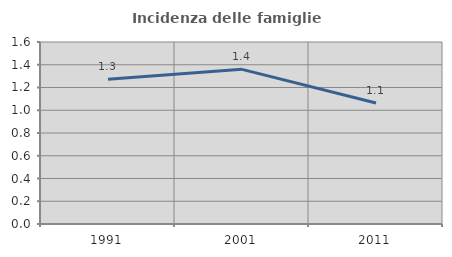
| Category | Incidenza delle famiglie numerose |
|---|---|
| 1991.0 | 1.272 |
| 2001.0 | 1.36 |
| 2011.0 | 1.064 |